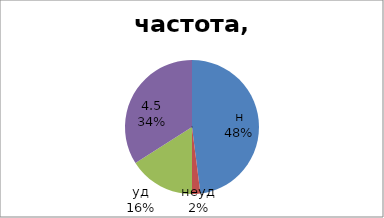
| Category | Series 0 |
|---|---|
| н | 48 |
| неуд | 2 |
| уд | 16 |
| 4,5 | 34 |